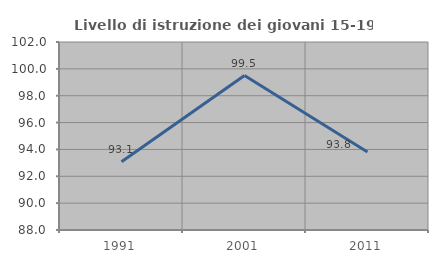
| Category | Livello di istruzione dei giovani 15-19 anni |
|---|---|
| 1991.0 | 93.077 |
| 2001.0 | 99.502 |
| 2011.0 | 93.814 |